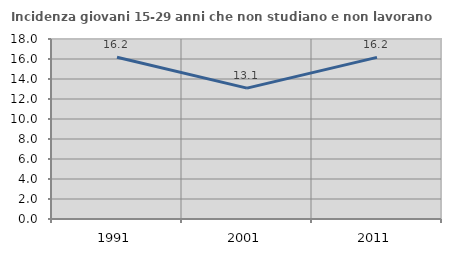
| Category | Incidenza giovani 15-29 anni che non studiano e non lavorano  |
|---|---|
| 1991.0 | 16.176 |
| 2001.0 | 13.084 |
| 2011.0 | 16.162 |